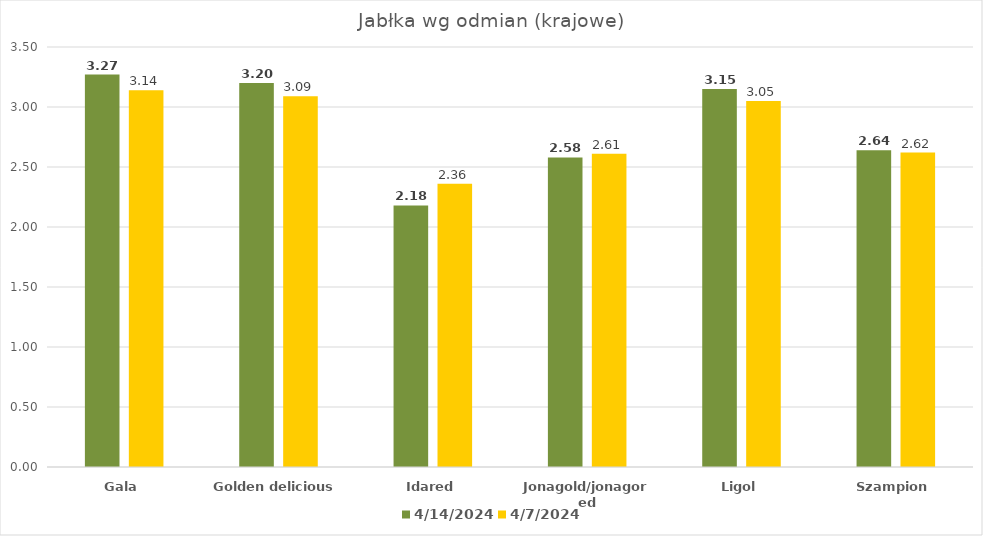
| Category | 2024-04-14 | 2024-04-07 |
|---|---|---|
| Gala | 3.27 | 3.14 |
| Golden delicious | 3.2 | 3.09 |
| Idared | 2.18 | 2.36 |
| Jonagold/jonagored | 2.58 | 2.61 |
| Ligol | 3.15 | 3.05 |
| Szampion | 2.64 | 2.62 |